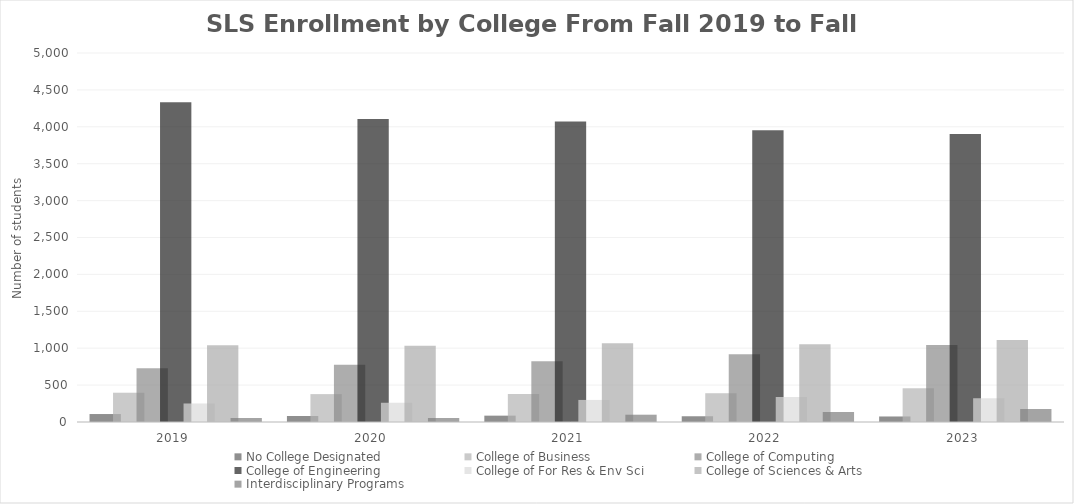
| Category | No College Designated | College of Business | College of Computing | College of Engineering | College of For Res & Env Sci | College of Sciences & Arts | Interdisciplinary Programs |
|---|---|---|---|---|---|---|---|
| 2019  | 108 | 397 | 730 | 4333 | 251 | 1039 | 54 |
| 2020  | 80 | 378 | 777 | 4106 | 261 | 1032 | 53 |
| 2021  | 86 | 379 | 823 | 4071 | 299 | 1067 | 99 |
| 2022  | 79 | 390 | 917 | 3952 | 338 | 1053 | 134 |
| 2023  | 75 | 459 | 1043 | 3903 | 322 | 1112 | 176 |